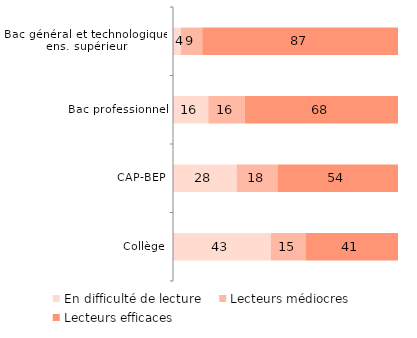
| Category | En difficulté de lecture | Lecteurs médiocres | Lecteurs efficaces |
|---|---|---|---|
| Collège | 43.451 | 15.385 | 41.164 |
| CAP-BEP | 28.353 | 18.052 | 53.594 |
| Bac professionnel | 15.683 | 16.191 | 68.126 |
| Bac général et technologique, ens. supérieur | 3.523 | 9.455 | 87.022 |